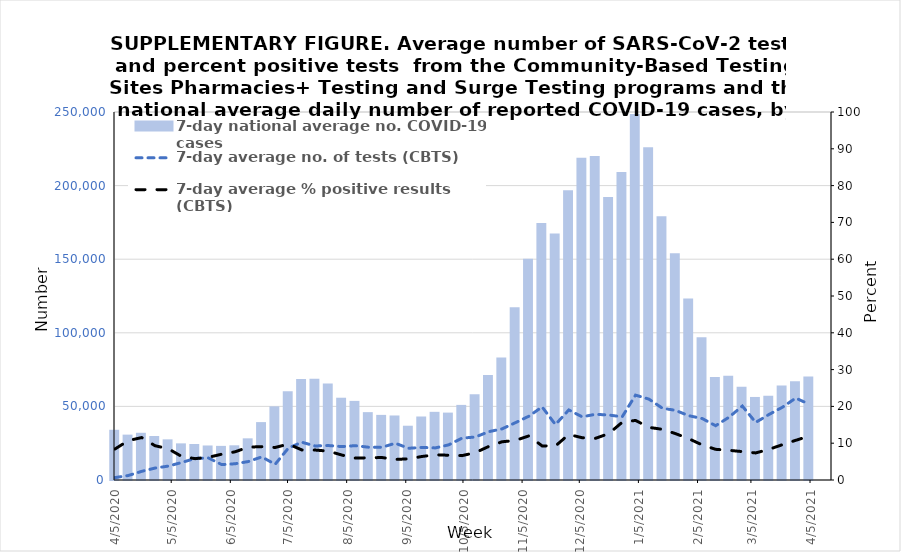
| Category | 7-day national average no. COVID-19 cases |
|---|---|
| 4/5/20 | 31738.143 |
| 4/12/20 | 28447.286 |
| 4/19/20 | 29702.429 |
| 4/26/20 | 27500.571 |
| 5/3/20 | 25237.714 |
| 5/10/20 | 22510.143 |
| 5/17/20 | 22085.571 |
| 5/24/20 | 21072 |
| 5/31/20 | 20803.857 |
| 6/7/20 | 21189 |
| 6/14/20 | 25924.857 |
| 6/21/20 | 36956.857 |
| 6/28/20 | 47667 |
| 7/5/20 | 57847.714 |
| 7/12/20 | 66278.571 |
| 7/19/20 | 66370.571 |
| 7/26/20 | 63114 |
| 8/2/20 | 53519.571 |
| 8/9/20 | 51370 |
| 8/16/20 | 43725.143 |
| 8/23/20 | 41859.429 |
| 8/30/20 | 41455.143 |
| 9/6/20 | 34495.429 |
| 9/13/20 | 40763.571 |
| 9/20/20 | 43930 |
| 9/27/20 | 43412.143 |
| 10/4/20 | 48645 |
| 10/11/20 | 55817.714 |
| 10/18/20 | 69026.286 |
| 10/25/20 | 80841.286 |
| 11/1/20 | 115024.714 |
| 11/8/20 | 147979.571 |
| 11/15/20 | 172268.714 |
| 11/22/20 | 165048 |
| 11/29/20 | 194518 |
| 12/6/20 | 216496 |
| 12/13/20 | 217728.286 |
| 12/20/20 | 189900 |
| 12/27/20 | 206890.714 |
| 1/3/21 | 246298.286 |
| 1/10/21 | 223716.571 |
| 1/17/21 | 176827 |
| 1/24/21 | 151597.857 |
| 1/31/21 | 120883.857 |
| 2/7/21 | 94675.714 |
| 2/14/21 | 67623.143 |
| 2/21/21 | 68459.143 |
| 2/28/21 | 61040.857 |
| 3/7/21 | 54033.571 |
| 3/14/21 | 54774.571 |
| 3/21/21 | 61828.143 |
| 3/28/21 | 64656.286 |
| 4/4/21 | 67870.714 |